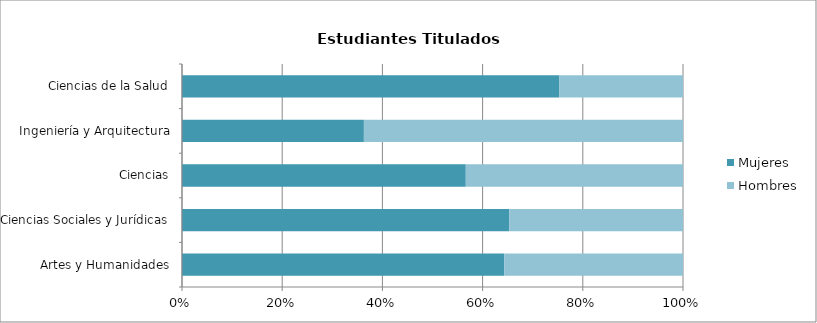
| Category | Mujeres | Hombres |
|---|---|---|
| Artes y Humanidades | 173 | 96 |
| Ciencias Sociales y Jurídicas | 1143 | 607 |
| Ciencias | 81 | 62 |
| Ingeniería y Arquitectura | 220 | 386 |
| Ciencias de la Salud | 394 | 129 |